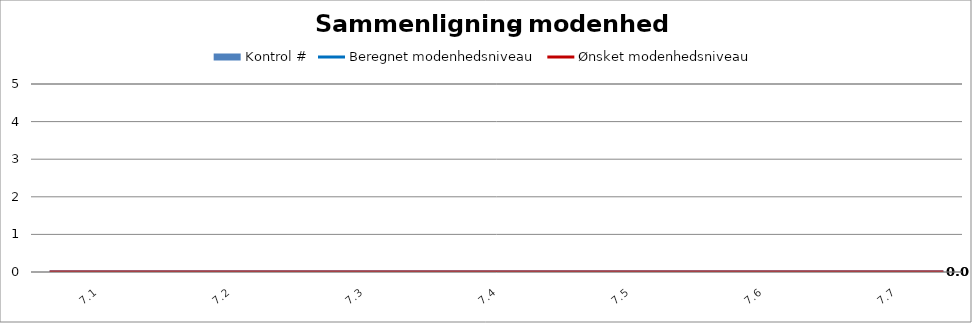
| Category | Kontrol # |
|---|---|
| 7.1 | 0 |
| 7.2 | 0 |
| 7.3 | 0 |
| 7.4 | 0 |
| 7.5 | 0 |
| 7.6 | 0 |
| 7.7 | 0 |